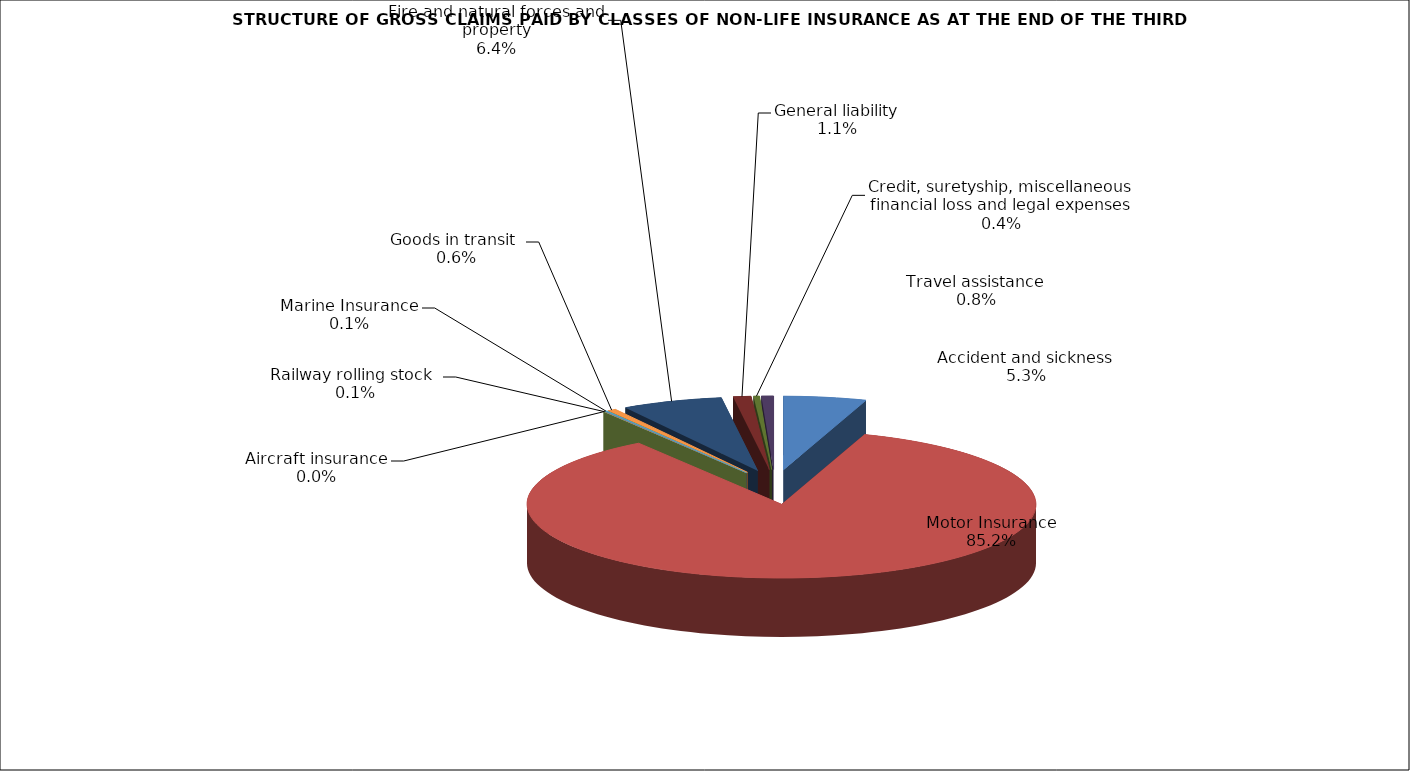
| Category | Accident and sickness |
|---|---|
| Accident and sickness | 0.053 |
| Motor Insurance | 0.852 |
| Railway rolling stock  | 0.001 |
| Aircraft insurance | 0 |
| Marine Insurance | 0.001 |
| Goods in transit  | 0.006 |
| Fire and natural forces and property | 0.064 |
| General liability | 0.011 |
| Credit, suretyship, miscellaneous financial loss and legal expenses | 0.004 |
| Travel assistance | 0.008 |